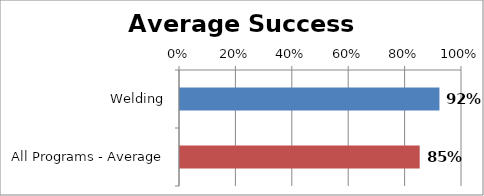
| Category | RetentionRate |
|---|---|
| Welding | 0.92 |
| All Programs - Average | 0.85 |